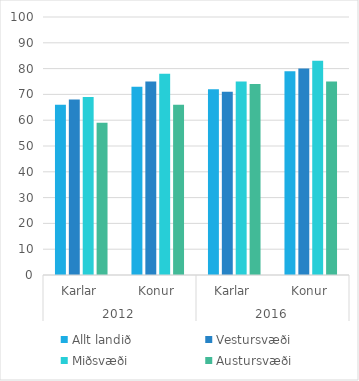
| Category | Allt landið | Vestursvæði | Miðsvæði | Austursvæði |
|---|---|---|---|---|
| 0 | 66 | 68 | 69 | 59 |
| 1 | 73 | 75 | 78 | 66 |
| 2 | 72 | 71 | 75 | 74 |
| 3 | 79 | 80 | 83 | 75 |